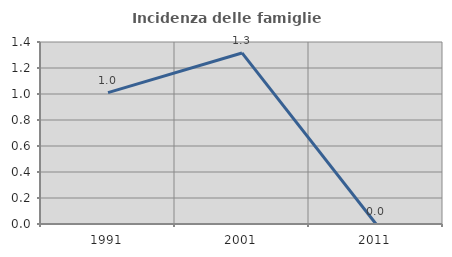
| Category | Incidenza delle famiglie numerose |
|---|---|
| 1991.0 | 1.01 |
| 2001.0 | 1.316 |
| 2011.0 | 0 |